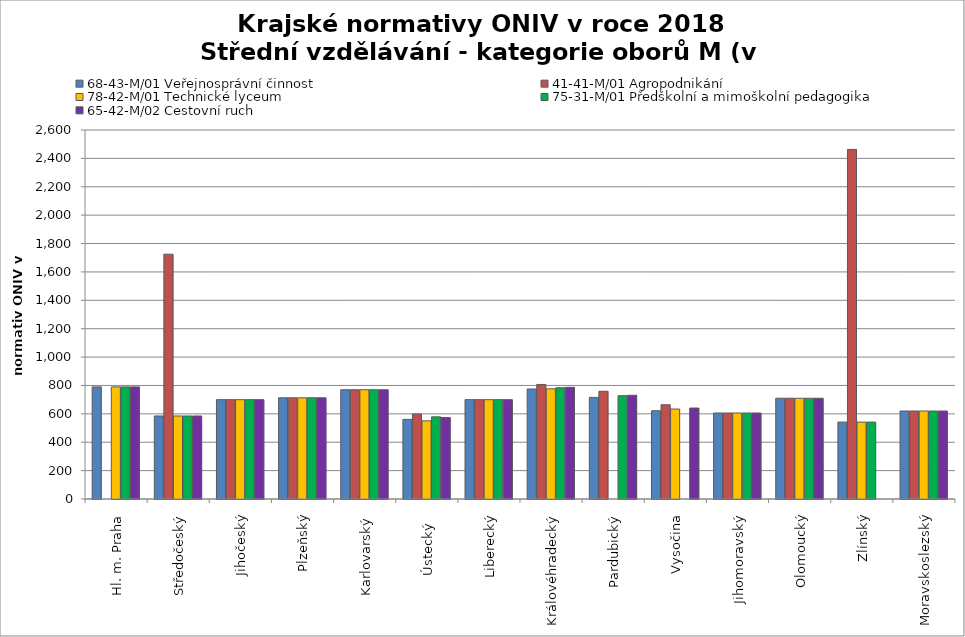
| Category | 68-43-M/01 Veřejnosprávní činnost | 41-41-M/01 Agropodnikání | 78-42-M/01 Technické lyceum | 75-31-M/01 Předškolní a mimoškolní pedagogika | 65-42-M/02 Cestovní ruch |
|---|---|---|---|---|---|
| Hl. m. Praha | 790 | 0 | 790 | 790 | 790 |
| Středočeský | 585 | 1725 | 585 | 585 | 585 |
| Jihočeský | 700 | 700 | 700 | 700 | 700 |
| Plzeňský | 713 | 713 | 713 | 713 | 713 |
| Karlovarský  | 770 | 770 | 770 | 770 | 770 |
| Ústecký   | 561 | 599 | 551 | 579 | 574 |
| Liberecký | 700 | 700 | 700 | 700 | 700 |
| Královéhradecký | 774.8 | 807 | 776.3 | 784 | 786.9 |
| Pardubický | 716 | 759 | 0 | 728 | 731 |
| Vysočina | 622 | 664 | 634 | 0 | 641 |
| Jihomoravský | 606 | 606 | 606 | 606 | 606 |
| Olomoucký | 710 | 710 | 710 | 710 | 710 |
| Zlínský | 542 | 2463 | 542 | 542 | 0 |
| Moravskoslezský | 620 | 620 | 620 | 620 | 620 |